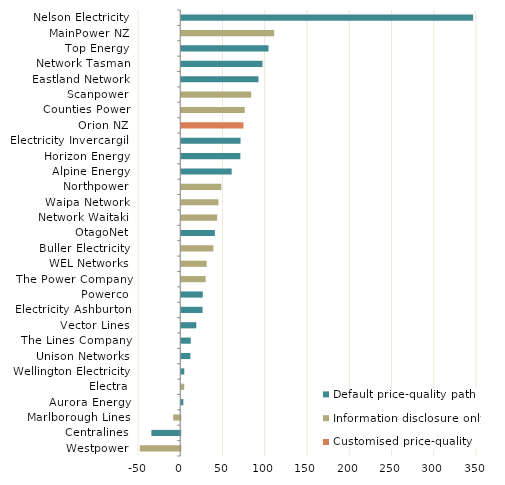
| Category | Default price-quality path | Information disclosure only | Customised price-quality path |
|---|---|---|---|
| Nelson Electricity | 345.424 | 0 | 0 |
| MainPower NZ | 0 | 109.991 | 0 |
| Top Energy | 103.287 | 0 | 0 |
| Network Tasman | 96.156 | 0 | 0 |
| Eastland Network | 91.412 | 0 | 0 |
| Scanpower | 0 | 82.758 | 0 |
| Counties Power | 0 | 75.18 | 0 |
| Orion NZ | 0 | 0 | 73.62 |
| Electricity Invercargill | 70.174 | 0 | 0 |
| Horizon Energy | 69.939 | 0 | 0 |
| Alpine Energy | 59.67 | 0 | 0 |
| Northpower | 0 | 47.358 | 0 |
| Waipa Network | 0 | 44.061 | 0 |
| Network Waitaki | 0 | 42.545 | 0 |
| OtagoNet | 39.798 | 0 | 0 |
| Buller Electricity | 0 | 38.07 | 0 |
| WEL Networks | 0 | 30.14 | 0 |
| The Power Company | 0 | 28.912 | 0 |
| Powerco | 25.497 | 0 | 0 |
| Electricity Ashburton | 25.204 | 0 | 0 |
| Vector Lines | 17.828 | 0 | 0 |
| The Lines Company | 11.277 | 0 | 0 |
| Unison Networks | 10.829 | 0 | 0 |
| Wellington Electricity | 3.588 | 0 | 0 |
| Electra | 0 | 3.497 | 0 |
| Aurora Energy | 2.514 | 0 | 0 |
| Marlborough Lines | 0 | -8.352 | 0 |
| Centralines | -34.159 | 0 | 0 |
| Westpower | 0 | -47.823 | 0 |